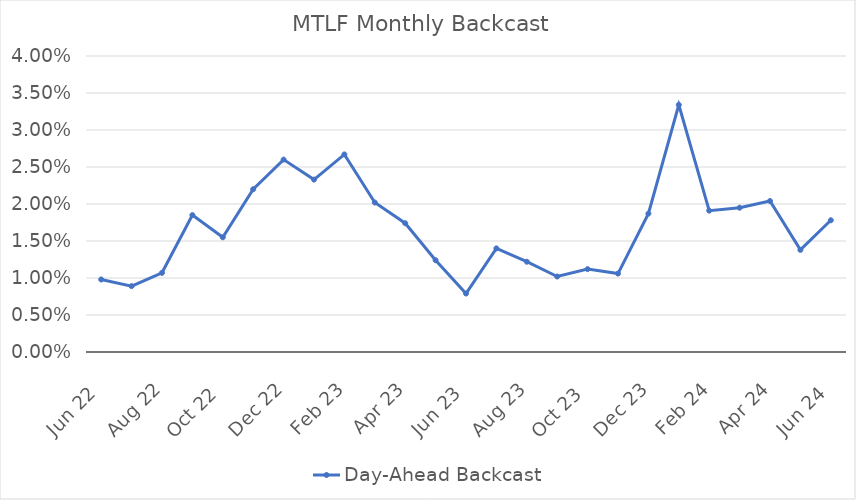
| Category | Day-Ahead Backcast |
|---|---|
| 2022-06-20 | 0.01 |
| 2022-07-20 | 0.009 |
| 2022-08-20 | 0.011 |
| 2022-09-20 | 0.018 |
| 2022-10-20 | 0.016 |
| 2022-11-20 | 0.022 |
| 2022-12-20 | 0.026 |
| 2023-01-20 | 0.023 |
| 2023-02-20 | 0.027 |
| 2023-03-20 | 0.02 |
| 2023-04-20 | 0.017 |
| 2023-05-20 | 0.012 |
| 2023-06-20 | 0.008 |
| 2023-07-20 | 0.014 |
| 2023-08-20 | 0.012 |
| 2023-09-20 | 0.01 |
| 2023-10-20 | 0.011 |
| 2023-11-20 | 0.011 |
| 2023-12-20 | 0.019 |
| 2024-01-20 | 0.033 |
| 2024-02-20 | 0.019 |
| 2024-03-20 | 0.02 |
| 2024-04-20 | 0.02 |
| 2024-05-24 | 0.014 |
| 2024-06-24 | 0.018 |